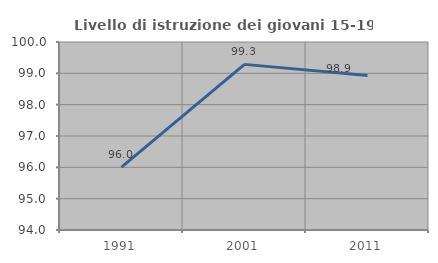
| Category | Livello di istruzione dei giovani 15-19 anni |
|---|---|
| 1991.0 | 96.008 |
| 2001.0 | 99.286 |
| 2011.0 | 98.932 |